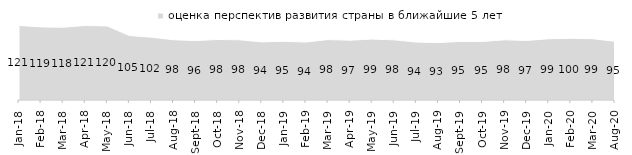
| Category | оценка перспектив развития страны в ближайшие 5 лет |
|---|---|
| 2018-01-01 | 120.9 |
| 2018-02-01 | 118.65 |
| 2018-03-01 | 118.1 |
| 2018-04-01 | 121 |
| 2018-05-01 | 120.15 |
| 2018-06-01 | 104.6 |
| 2018-07-01 | 101.85 |
| 2018-08-01 | 97.85 |
| 2018-09-01 | 96.4 |
| 2018-10-01 | 98.25 |
| 2018-11-01 | 97.705 |
| 2018-12-01 | 94.3 |
| 2019-01-01 | 95.25 |
| 2019-02-01 | 94.05 |
| 2019-03-01 | 98.11 |
| 2019-04-01 | 97.03 |
| 2019-05-01 | 98.91 |
| 2019-06-01 | 97.656 |
| 2019-07-01 | 94.01 |
| 2019-08-01 | 93.207 |
| 2019-09-01 | 95.099 |
| 2019-10-01 | 95 |
| 2019-11-01 | 97.673 |
| 2019-12-01 | 96.733 |
| 2020-01-01 | 99.356 |
| 2020-02-01 | 100.198 |
| 2020-03-01 | 99.455 |
| 2020-08-01 | 95.333 |